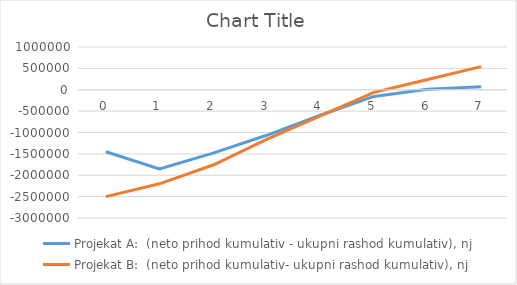
| Category | Projekat A:  (neto prihod kumulativ - ukupni rashod kumulativ), nj | Projekat B:  (neto prihod kumulativ- ukupni rashod kumulativ), nj |
|---|---|---|
| 0.0 | -1450000 | -2500000 |
| 1.0 | -1850000 | -2200000 |
| 2.0 | -1481500 | -1760000 |
| 3.0 | -1065195 | -1160000 |
| 4.0 | -596562.1 | -610000 |
| 5.0 | -156705.6 | -60000 |
| 6.0 | 12549.7 | 240000 |
| 7.0 | 70591.3 | 540000 |